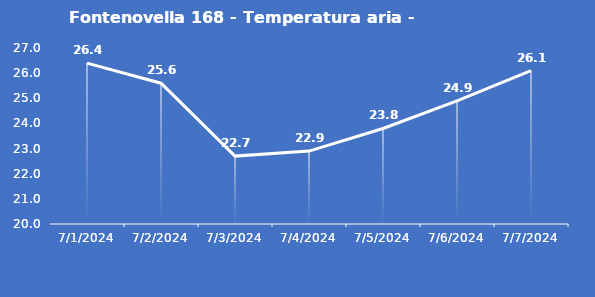
| Category | Fontenovella 168 - Temperatura aria - Grezzo (°C) |
|---|---|
| 7/1/24 | 26.4 |
| 7/2/24 | 25.6 |
| 7/3/24 | 22.7 |
| 7/4/24 | 22.9 |
| 7/5/24 | 23.8 |
| 7/6/24 | 24.9 |
| 7/7/24 | 26.1 |